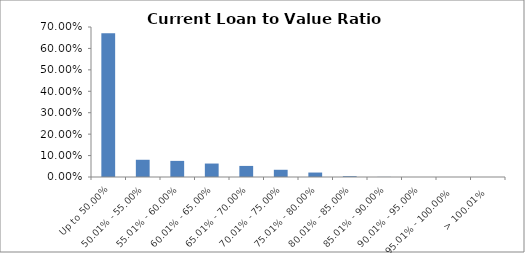
| Category | Series 0 |
|---|---|
| Up to 50.00% | 0.671 |
| 50.01% - 55.00% | 0.08 |
| 55.01% - 60.00% | 0.075 |
| 60.01% - 65.00% | 0.063 |
| 65.01% - 70.00% | 0.052 |
| 70.01% - 75.00% | 0.034 |
| 75.01% - 80.00% | 0.021 |
| 80.01% - 85.00% | 0.004 |
| 85.01% - 90.00% | 0.001 |
| 90.01% - 95.00% | 0 |
| 95.01% - 100.00% | 0 |
| > 100.01% | 0 |